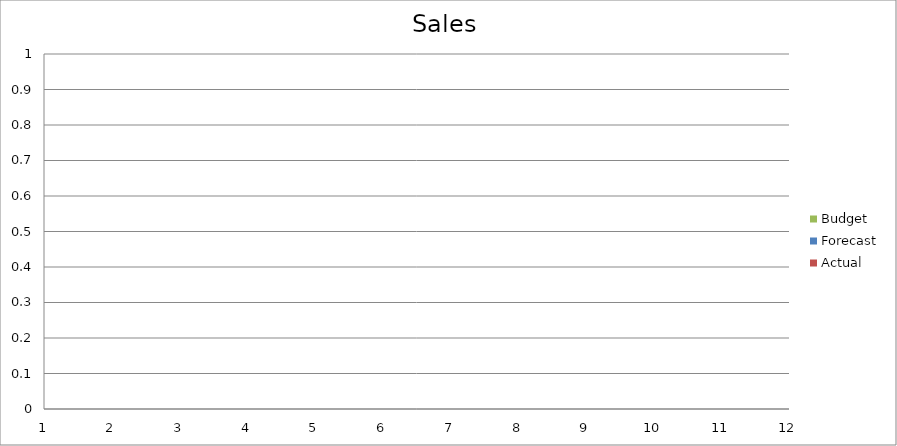
| Category | Budget | Forecast | Actual |
|---|---|---|---|
| 0 | 780 | 1550 | 760 |
| 1 | 2850 | 1830 | 1260 |
| 2 | 2160 | 620 | 3420 |
| 3 | 940 | 930 | 1840 |
| 4 | 2690 | 3100 | 1020 |
| 5 | 3380 | 1090 | 3180 |
| 6 | 2170 | 820 | 1630 |
| 7 | 2980 | 710 | 3110 |
| 8 | 2430 | 2390 | 540 |
| 9 | 1340 | 3350 | 1280 |
| 10 | 630 | 1370 | 2990 |
| 11 | 2450 | 1240 | 3480 |